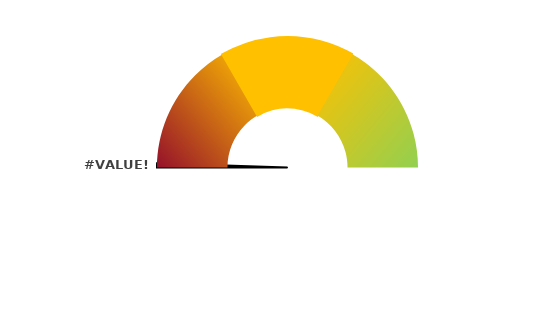
| Category | Series 1 |
|---|---|
| nan | 0 |
| 0.0 | 1 |
| nan | 197 |